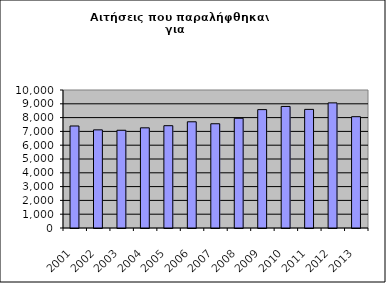
| Category | Series 1 |
|---|---|
| 2001.0 | 7392 |
| 2002.0 | 7111 |
| 2003.0 | 7083 |
| 2004.0 | 7258 |
| 2005.0 | 7413 |
| 2006.0 | 7697 |
| 2007.0 | 7554 |
| 2008.0 | 7952 |
| 2009.0 | 8579 |
| 2010.0 | 8808 |
| 2011.0 | 8595 |
| 2012.0 | 9067 |
| 2013.0 | 8066 |